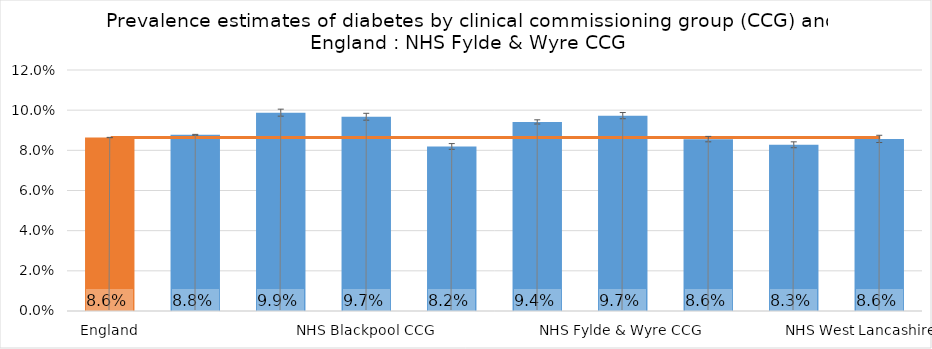
| Category | Series 0 |
|---|---|
| England | 0.086 |
| North West | 0.088 |
| NHS Blackburn with Darwen CCG | 0.099 |
| NHS Blackpool CCG | 0.097 |
| NHS Chorley and South Ribble CCG | 0.082 |
| NHS East Lancashire CCG | 0.094 |
| NHS Fylde & Wyre CCG | 0.097 |
| NHS Greater Preston CCG | 0.086 |
| NHS Lancashire North CCG | 0.083 |
| NHS West Lancashire CCG | 0.086 |